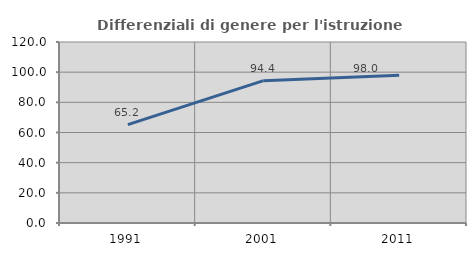
| Category | Differenziali di genere per l'istruzione superiore |
|---|---|
| 1991.0 | 65.215 |
| 2001.0 | 94.378 |
| 2011.0 | 97.969 |